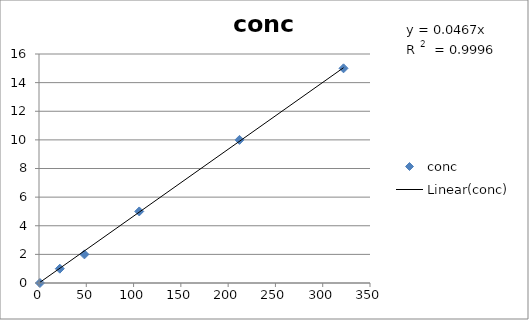
| Category | conc |
|---|---|
| 1.0 | 0 |
| 22.0 | 1 |
| 48.0 | 2 |
| 106.0 | 5 |
| 212.0 | 10 |
| 322.0 | 15 |